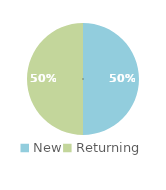
| Category | Series 0 |
|---|---|
| New | 0.5 |
| Returning | 0.5 |